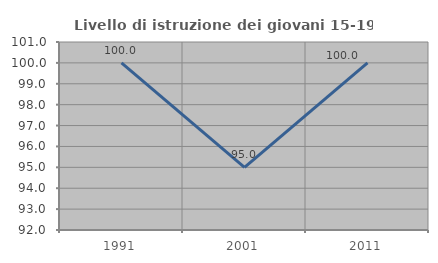
| Category | Livello di istruzione dei giovani 15-19 anni |
|---|---|
| 1991.0 | 100 |
| 2001.0 | 95 |
| 2011.0 | 100 |